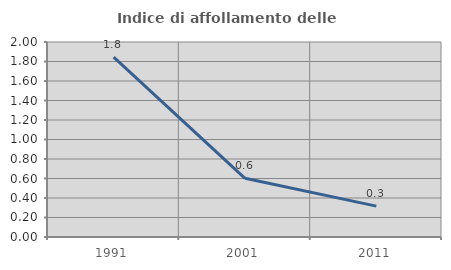
| Category | Indice di affollamento delle abitazioni  |
|---|---|
| 1991.0 | 1.846 |
| 2001.0 | 0.602 |
| 2011.0 | 0.317 |